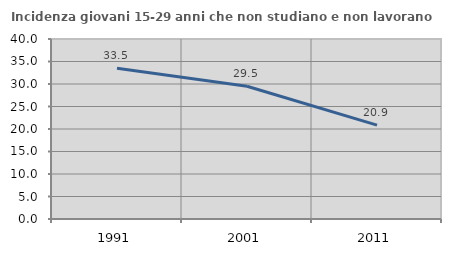
| Category | Incidenza giovani 15-29 anni che non studiano e non lavorano  |
|---|---|
| 1991.0 | 33.523 |
| 2001.0 | 29.51 |
| 2011.0 | 20.874 |